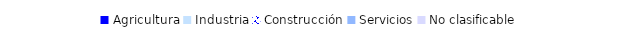
| Category | Series 0 | Series 1 |
|---|---|---|
| Agricultura | 0 | 0 |
| Industria | 0 | 0 |
| Construcción | 0 | 0 |
| Servicios | 0 | 0 |
| No clasificable | 0 | 0 |